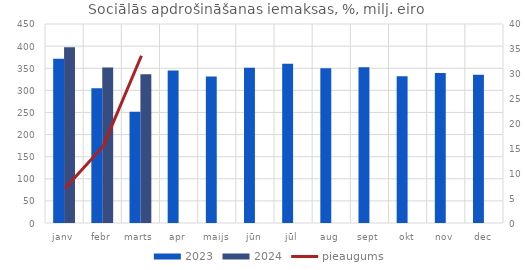
| Category | 2023 | 2024 |
|---|---|---|
| janv | 371.697 | 397.664 |
| febr | 304.659 | 351.713 |
| marts | 251.649 | 336.269 |
| apr | 344.906 | 0 |
| maijs | 331.367 | 0 |
| jūn | 350.907 | 0 |
| jūl | 360.075 | 0 |
| aug | 349.945 | 0 |
| sept | 352.283 | 0 |
| okt | 331.699 | 0 |
| nov | 339.067 | 0 |
| dec | 335.273 | 0 |